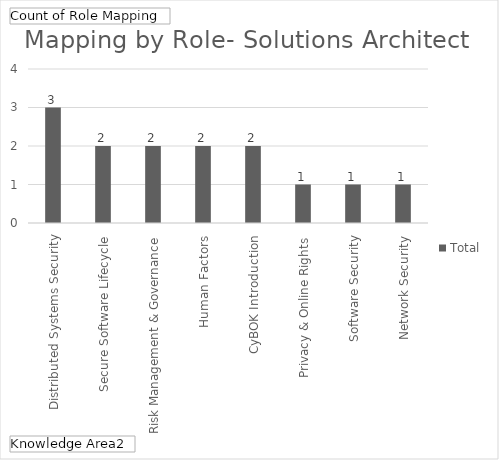
| Category | Total |
|---|---|
| Distributed Systems Security | 3 |
| Secure Software Lifecycle | 2 |
| Risk Management & Governance | 2 |
| Human Factors | 2 |
| CyBOK Introduction | 2 |
| Privacy & Online Rights | 1 |
| Software Security | 1 |
| Network Security | 1 |